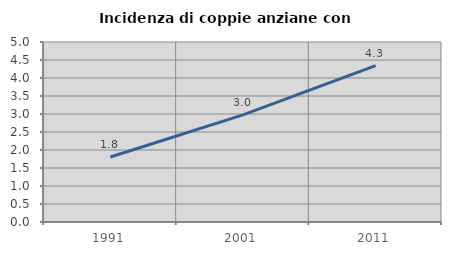
| Category | Incidenza di coppie anziane con figli |
|---|---|
| 1991.0 | 1.804 |
| 2001.0 | 2.974 |
| 2011.0 | 4.346 |